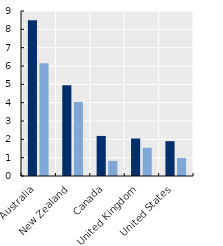
| Category | 2019 | 2010 |
|---|---|---|
| Australia | 8.49 | 6.144 |
| New Zealand | 4.943 | 4.033 |
| Canada | 2.184 | 0.826 |
| United Kingdom | 2.043 | 1.54 |
| United States | 1.899 | 0.989 |